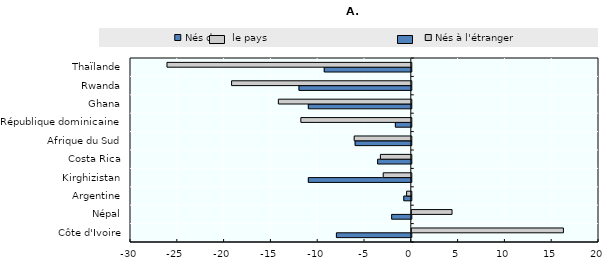
| Category | Nés dans le pays | Nés à l'étranger |
|---|---|---|
| Côte d'Ivoire | -8 | 16.2 |
| Népal | -2.1 | 4.3 |
| Argentine | -0.8 | -0.5 |
| Kirghizistan | -11 | -3 |
| Costa Rica | -3.6 | -3.3 |
| Afrique du Sud | -6 | -6.1 |
| République dominicaine | -1.7 | -11.8 |
| Ghana | -11 | -14.2 |
| Rwanda | -12 | -19.2 |
| Thaïlande | -9.3 | -26.1 |